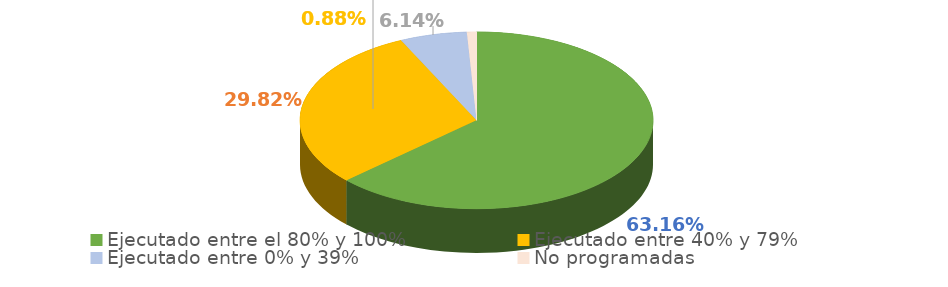
| Category | Series 0 |
|---|---|
| Ejecutado entre el 80% y 100% | 0.632 |
| Ejecutado entre 40% y 79% | 0.298 |
| Ejecutado entre 0% y 39% | 0.061 |
| No programadas | 0.009 |